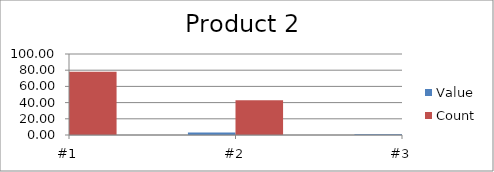
| Category | Value | Count |
|---|---|---|
| #1 | 5 | 78 |
| #2 | 3 | 43 |
| #3 | 1 | 37 |